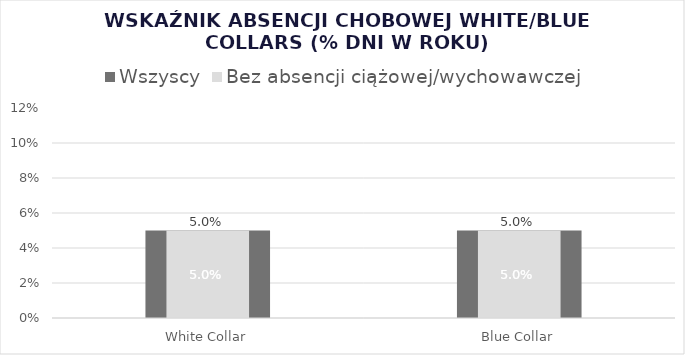
| Category | Wszyscy |
|---|---|
| White Collar | 0.05 |
| Blue Collar | 0.05 |